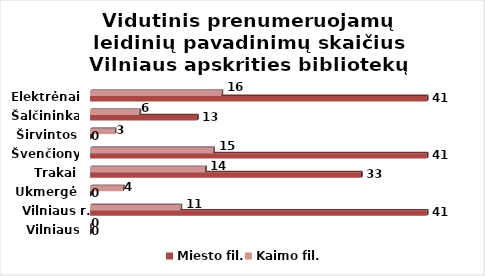
| Category | Miesto fil. | Kaimo fil. |
|---|---|---|
| Vilniaus m. | 0 | 0 |
| Vilniaus r. | 41 | 11 |
| Ukmergė | 0 | 4 |
| Trakai | 33 | 14 |
| Švenčionys | 41 | 15 |
| Širvintos | 0 | 3 |
| Šalčininkai | 13 | 6 |
| Elektrėnai | 41 | 16 |